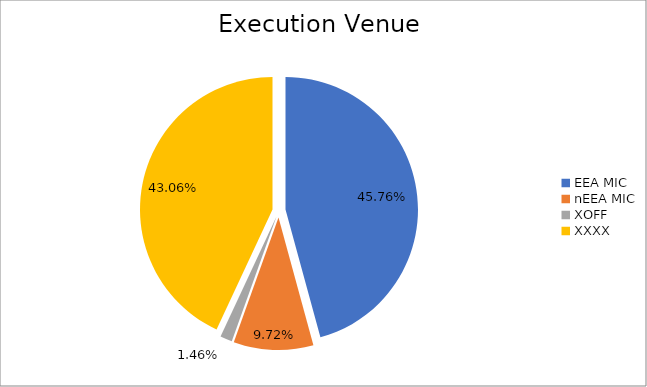
| Category | Series 0 |
|---|---|
| EEA MIC | 5461935.191 |
| nEEA MIC | 1160413.884 |
| XOFF | 174292.687 |
| XXXX | 5140419.721 |